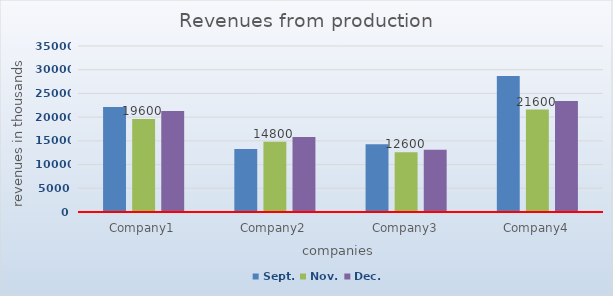
| Category | Sept. | Nov. | Dec. |
|---|---|---|---|
| Company1 | 22160 | 19600 | 21300 |
| Company2 | 13262 | 14800 | 15800 |
| Company3 | 14300 | 12600 | 13100 |
| Company4 | 28700 | 21600 | 23400 |